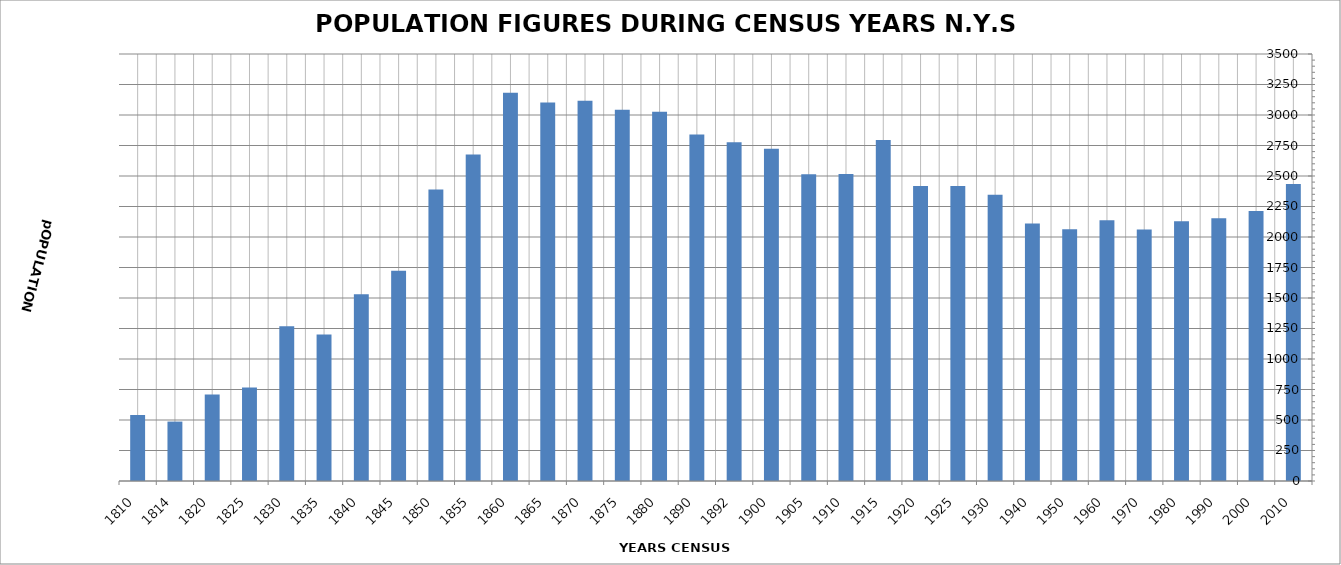
| Category | POPULATION |
|---|---|
| 1810.0 | 541 |
| 1814.0 | 487 |
| 1820.0 | 709 |
| 1825.0 | 766 |
| 1830.0 | 1268 |
| 1835.0 | 1200 |
| 1840.0 | 1531 |
| 1845.0 | 1723 |
| 1850.0 | 2389 |
| 1855.0 | 2676 |
| 1860.0 | 3182 |
| 1865.0 | 3102 |
| 1870.0 | 3116 |
| 1875.0 | 3044 |
| 1880.0 | 3027 |
| 1890.0 | 2840 |
| 1892.0 | 2777 |
| 1900.0 | 2723 |
| 1905.0 | 2515 |
| 1910.0 | 2516 |
| 1915.0 | 2795 |
| 1920.0 | 2419 |
| 1925.0 | 2419 |
| 1930.0 | 2346 |
| 1940.0 | 2110 |
| 1950.0 | 2063 |
| 1960.0 | 2137 |
| 1970.0 | 2062 |
| 1980.0 | 2130 |
| 1990.0 | 2153 |
| 2000.0 | 2213 |
| 2010.0 | 2434 |